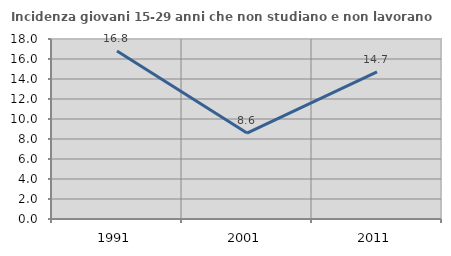
| Category | Incidenza giovani 15-29 anni che non studiano e non lavorano  |
|---|---|
| 1991.0 | 16.806 |
| 2001.0 | 8.597 |
| 2011.0 | 14.706 |